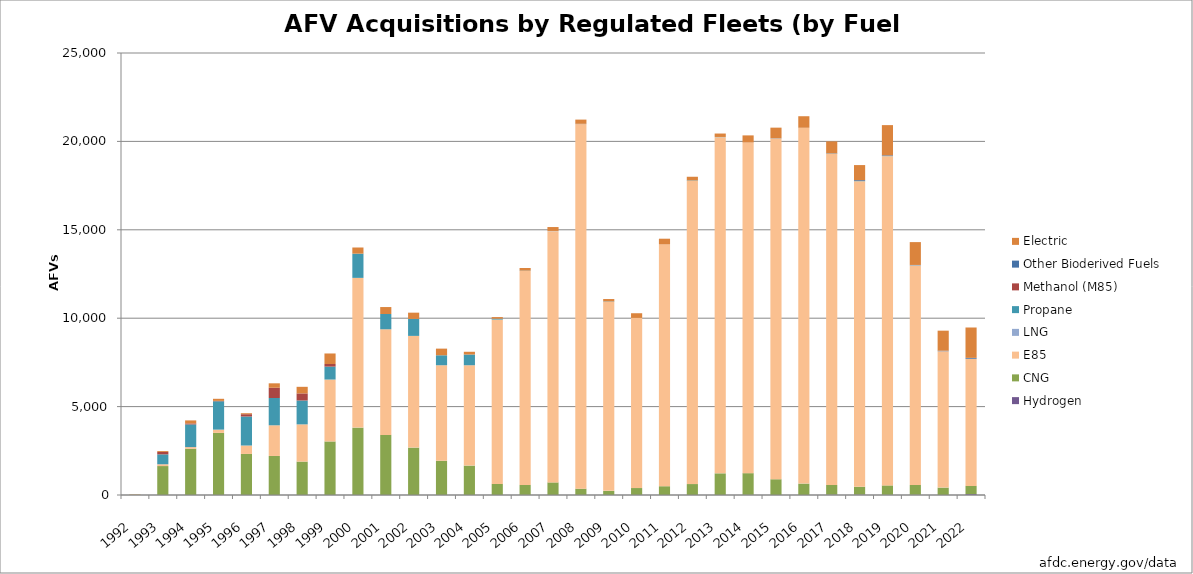
| Category | Hydrogen | CNG | E85 | LNG | Propane | Methanol (M85) | Other Bioderived Fuels | Electric |
|---|---|---|---|---|---|---|---|---|
| 1992.0 | 0 | 11 | 0 | 0 | 0 | 0 | 0 | 16 |
| 1993.0 | 0 | 1637 | 102 | 0 | 560 | 132 | 0 | 52 |
| 1994.0 | 0 | 2617 | 92 | 2 | 1281 | 56 | 0 | 171 |
| 1995.0 | 0 | 3513 | 185 | 0 | 1603 | 23 | 0 | 117 |
| 1996.0 | 0 | 2322 | 474 | 3 | 1641 | 130 | 0 | 56 |
| 1997.0 | 0 | 2208 | 1734 | 0 | 1545 | 579 | 0 | 251 |
| 1998.0 | 0 | 1890 | 2105 | 0 | 1351 | 401 | 0 | 372 |
| 1999.0 | 0 | 3029 | 3500 | 1 | 731 | 149 | 0 | 595 |
| 2000.0 | 0 | 3811 | 8469 | 0 | 1370 | 0 | 0 | 349 |
| 2001.0 | 0 | 3400 | 5973 | 1 | 865 | 0 | 0 | 392 |
| 2002.0 | 1 | 2679 | 6319 | 0 | 961 | 0 | 0 | 353 |
| 2003.0 | 0 | 1937 | 5402 | 0 | 564 | 0 | 0 | 376 |
| 2004.0 | 0 | 1662 | 5677 | 0 | 607 | 0 | 0 | 155 |
| 2005.0 | 1 | 627 | 9294 | 1 | 48 | 0 | 0 | 92 |
| 2006.0 | 7 | 563 | 12102 | 0 | 17 | 0 | 0 | 151 |
| 2007.0 | 0 | 713 | 14212 | 4 | 7 | 0 | 0 | 220 |
| 2008.0 | 2 | 354 | 20623 | 5 | 10 | 0 | 0 | 239 |
| 2009.0 | 1 | 233 | 10694 | 0 | 19 | 0 | 0 | 137 |
| 2010.0 | 3 | 390 | 9618 | 0 | 5 | 0 | 0 | 265 |
| 2011.0 | 0 | 496 | 13681 | 0 | 1 | 0 | 0 | 318 |
| 2012.0 | 0 | 618 | 17153 | 0 | 21 | 0 | 0 | 208 |
| 2013.0 | 0 | 1224 | 19016 | 0 | 8 | 3 | 0 | 194 |
| 2014.0 | 9 | 1228 | 18700 | 0 | 0 | 0 | 0 | 403 |
| 2015.0 | 0 | 891 | 19282 | 0 | 4 | 0 | 9 | 592 |
| 2016.0 | 1 | 644 | 20123 | 0 | 1 | 0 | 3 | 652 |
| 2017.0 | 21 | 546 | 18731 | 0 | 12 | 0 | 13 | 678 |
| 2018.0 | 24 | 440 | 17283 | 0 | 12 | 0 | 48 | 854 |
| 2019.0 | 9 | 534 | 18622 | 0 | 10 | 0 | 36 | 1710 |
| 2020.0 | 15 | 553 | 12419 | 0 | 10 | 0 | 15 | 1292 |
| 2021.0 | 0 | 418 | 7713 | 0 | 1 | 0 | 30 | 1133 |
| 2022.0 | 49 | 465 | 7192 | 0 | 0 | 0 | 50 | 1718 |